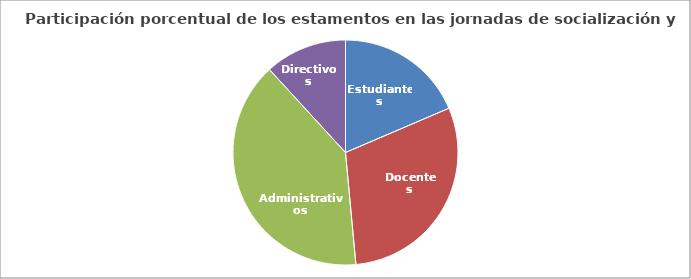
| Category | Series 0 |
|---|---|
| Estudiantes | 44 |
| Docentes | 71 |
| Administrativos | 94 |
| Directivos | 28 |